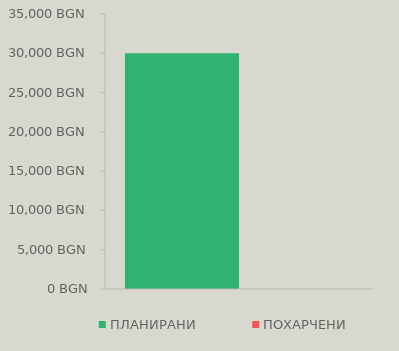
| Category | ПЛАНИРАНИ | ПОХАРЧЕНИ |
|---|---|---|
| 0 | 30000 | 0 |